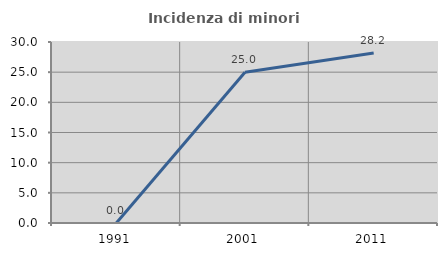
| Category | Incidenza di minori stranieri |
|---|---|
| 1991.0 | 0 |
| 2001.0 | 25 |
| 2011.0 | 28.182 |